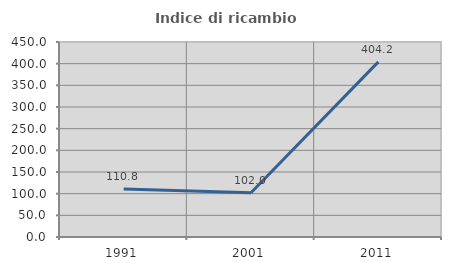
| Category | Indice di ricambio occupazionale  |
|---|---|
| 1991.0 | 110.843 |
| 2001.0 | 101.961 |
| 2011.0 | 404.167 |